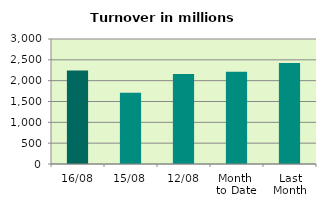
| Category | Series 0 |
|---|---|
| 16/08 | 2243.326 |
| 15/08 | 1710.002 |
| 12/08 | 2161.682 |
| Month 
to Date | 2212.135 |
| Last
Month | 2421.628 |